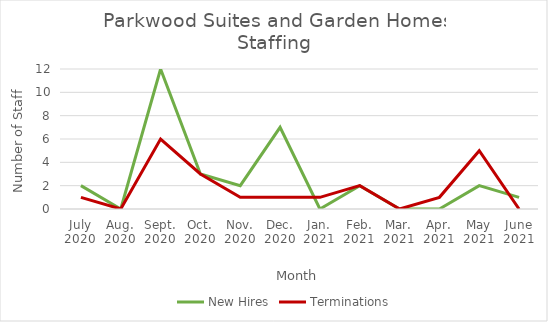
| Category | New Hires | Terminations |
|---|---|---|
| July
2020 | 2 | 1 |
| Aug.
2020 | 0 | 0 |
| Sept.
2020 | 12 | 6 |
| Oct.
2020 | 3 | 3 |
| Nov.
2020 | 2 | 1 |
| Dec.
2020 | 7 | 1 |
| Jan.
2021 | 0 | 1 |
| Feb.
2021 | 2 | 2 |
| Mar.
2021 | 0 | 0 |
| Apr.
2021 | 0 | 1 |
| May
2021 | 2 | 5 |
| June
2021 | 1 | 0 |